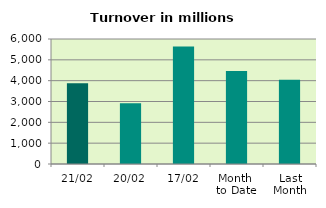
| Category | Series 0 |
|---|---|
| 21/02 | 3870.068 |
| 20/02 | 2915.543 |
| 17/02 | 5642.142 |
| Month 
to Date | 4467.317 |
| Last
Month | 4043.095 |